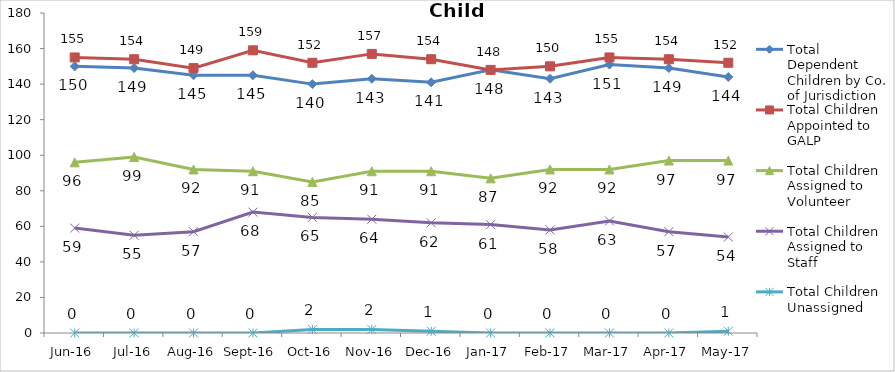
| Category | Total Dependent Children by Co. of Jurisdiction | Total Children Appointed to GALP | Total Children Assigned to Volunteer | Total Children Assigned to Staff | Total Children Unassigned |
|---|---|---|---|---|---|
| Jun-16 | 150 | 155 | 96 | 59 | 0 |
| Jul-16 | 149 | 154 | 99 | 55 | 0 |
| Aug-16 | 145 | 149 | 92 | 57 | 0 |
| Sep-16 | 145 | 159 | 91 | 68 | 0 |
| Oct-16 | 140 | 152 | 85 | 65 | 2 |
| Nov-16 | 143 | 157 | 91 | 64 | 2 |
| Dec-16 | 141 | 154 | 91 | 62 | 1 |
| Jan-17 | 148 | 148 | 87 | 61 | 0 |
| Feb-17 | 143 | 150 | 92 | 58 | 0 |
| Mar-17 | 151 | 155 | 92 | 63 | 0 |
| Apr-17 | 149 | 154 | 97 | 57 | 0 |
| May-17 | 144 | 152 | 97 | 54 | 1 |